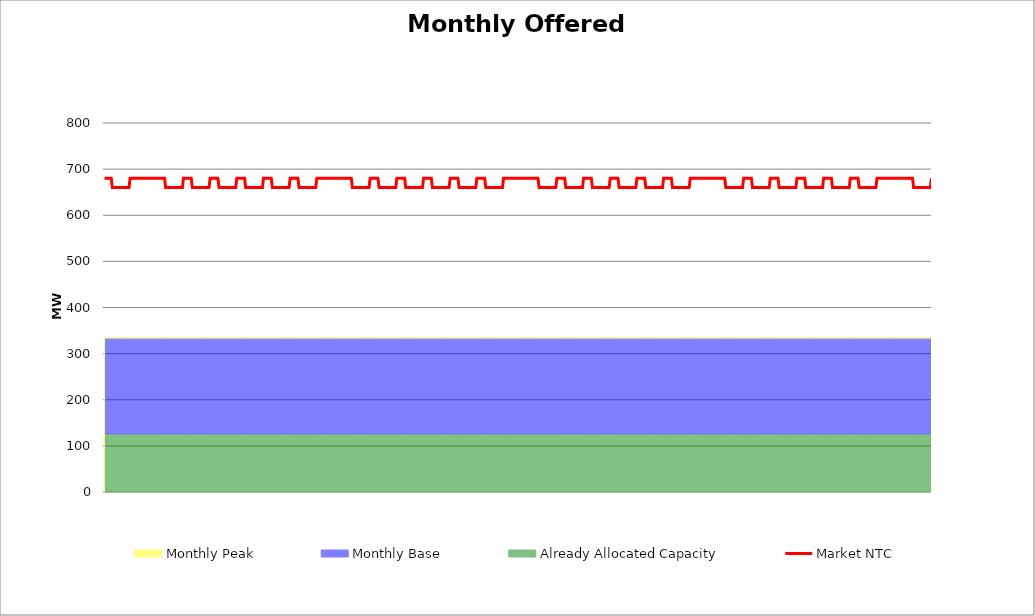
| Category | Market NTC |
|---|---|
| 0 | 680 |
| 1 | 680 |
| 2 | 680 |
| 3 | 680 |
| 4 | 680 |
| 5 | 680 |
| 6 | 680 |
| 7 | 660 |
| 8 | 660 |
| 9 | 660 |
| 10 | 660 |
| 11 | 660 |
| 12 | 660 |
| 13 | 660 |
| 14 | 660 |
| 15 | 660 |
| 16 | 660 |
| 17 | 660 |
| 18 | 660 |
| 19 | 660 |
| 20 | 660 |
| 21 | 660 |
| 22 | 660 |
| 23 | 680 |
| 24 | 680 |
| 25 | 680 |
| 26 | 680 |
| 27 | 680 |
| 28 | 680 |
| 29 | 680 |
| 30 | 680 |
| 31 | 680 |
| 32 | 680 |
| 33 | 680 |
| 34 | 680 |
| 35 | 680 |
| 36 | 680 |
| 37 | 680 |
| 38 | 680 |
| 39 | 680 |
| 40 | 680 |
| 41 | 680 |
| 42 | 680 |
| 43 | 680 |
| 44 | 680 |
| 45 | 680 |
| 46 | 680 |
| 47 | 680 |
| 48 | 680 |
| 49 | 680 |
| 50 | 680 |
| 51 | 680 |
| 52 | 680 |
| 53 | 680 |
| 54 | 680 |
| 55 | 660 |
| 56 | 660 |
| 57 | 660 |
| 58 | 660 |
| 59 | 660 |
| 60 | 660 |
| 61 | 660 |
| 62 | 660 |
| 63 | 660 |
| 64 | 660 |
| 65 | 660 |
| 66 | 660 |
| 67 | 660 |
| 68 | 660 |
| 69 | 660 |
| 70 | 660 |
| 71 | 680 |
| 72 | 680 |
| 73 | 680 |
| 74 | 680 |
| 75 | 680 |
| 76 | 680 |
| 77 | 680 |
| 78 | 680 |
| 79 | 660 |
| 80 | 660 |
| 81 | 660 |
| 82 | 660 |
| 83 | 660 |
| 84 | 660 |
| 85 | 660 |
| 86 | 660 |
| 87 | 660 |
| 88 | 660 |
| 89 | 660 |
| 90 | 660 |
| 91 | 660 |
| 92 | 660 |
| 93 | 660 |
| 94 | 660 |
| 95 | 680 |
| 96 | 680 |
| 97 | 680 |
| 98 | 680 |
| 99 | 680 |
| 100 | 680 |
| 101 | 680 |
| 102 | 680 |
| 103 | 660 |
| 104 | 660 |
| 105 | 660 |
| 106 | 660 |
| 107 | 660 |
| 108 | 660 |
| 109 | 660 |
| 110 | 660 |
| 111 | 660 |
| 112 | 660 |
| 113 | 660 |
| 114 | 660 |
| 115 | 660 |
| 116 | 660 |
| 117 | 660 |
| 118 | 660 |
| 119 | 680 |
| 120 | 680 |
| 121 | 680 |
| 122 | 680 |
| 123 | 680 |
| 124 | 680 |
| 125 | 680 |
| 126 | 680 |
| 127 | 660 |
| 128 | 660 |
| 129 | 660 |
| 130 | 660 |
| 131 | 660 |
| 132 | 660 |
| 133 | 660 |
| 134 | 660 |
| 135 | 660 |
| 136 | 660 |
| 137 | 660 |
| 138 | 660 |
| 139 | 660 |
| 140 | 660 |
| 141 | 660 |
| 142 | 660 |
| 143 | 680 |
| 144 | 680 |
| 145 | 680 |
| 146 | 680 |
| 147 | 680 |
| 148 | 680 |
| 149 | 680 |
| 150 | 680 |
| 151 | 660 |
| 152 | 660 |
| 153 | 660 |
| 154 | 660 |
| 155 | 660 |
| 156 | 660 |
| 157 | 660 |
| 158 | 660 |
| 159 | 660 |
| 160 | 660 |
| 161 | 660 |
| 162 | 660 |
| 163 | 660 |
| 164 | 660 |
| 165 | 660 |
| 166 | 660 |
| 167 | 680 |
| 168 | 680 |
| 169 | 680 |
| 170 | 680 |
| 171 | 680 |
| 172 | 680 |
| 173 | 680 |
| 174 | 680 |
| 175 | 660 |
| 176 | 660 |
| 177 | 660 |
| 178 | 660 |
| 179 | 660 |
| 180 | 660 |
| 181 | 660 |
| 182 | 660 |
| 183 | 660 |
| 184 | 660 |
| 185 | 660 |
| 186 | 660 |
| 187 | 660 |
| 188 | 660 |
| 189 | 660 |
| 190 | 660 |
| 191 | 680 |
| 192 | 680 |
| 193 | 680 |
| 194 | 680 |
| 195 | 680 |
| 196 | 680 |
| 197 | 680 |
| 198 | 680 |
| 199 | 680 |
| 200 | 680 |
| 201 | 680 |
| 202 | 680 |
| 203 | 680 |
| 204 | 680 |
| 205 | 680 |
| 206 | 680 |
| 207 | 680 |
| 208 | 680 |
| 209 | 680 |
| 210 | 680 |
| 211 | 680 |
| 212 | 680 |
| 213 | 680 |
| 214 | 680 |
| 215 | 680 |
| 216 | 680 |
| 217 | 680 |
| 218 | 680 |
| 219 | 680 |
| 220 | 680 |
| 221 | 680 |
| 222 | 680 |
| 223 | 660 |
| 224 | 660 |
| 225 | 660 |
| 226 | 660 |
| 227 | 660 |
| 228 | 660 |
| 229 | 660 |
| 230 | 660 |
| 231 | 660 |
| 232 | 660 |
| 233 | 660 |
| 234 | 660 |
| 235 | 660 |
| 236 | 660 |
| 237 | 660 |
| 238 | 660 |
| 239 | 680 |
| 240 | 680 |
| 241 | 680 |
| 242 | 680 |
| 243 | 680 |
| 244 | 680 |
| 245 | 680 |
| 246 | 680 |
| 247 | 660 |
| 248 | 660 |
| 249 | 660 |
| 250 | 660 |
| 251 | 660 |
| 252 | 660 |
| 253 | 660 |
| 254 | 660 |
| 255 | 660 |
| 256 | 660 |
| 257 | 660 |
| 258 | 660 |
| 259 | 660 |
| 260 | 660 |
| 261 | 660 |
| 262 | 660 |
| 263 | 680 |
| 264 | 680 |
| 265 | 680 |
| 266 | 680 |
| 267 | 680 |
| 268 | 680 |
| 269 | 680 |
| 270 | 680 |
| 271 | 660 |
| 272 | 660 |
| 273 | 660 |
| 274 | 660 |
| 275 | 660 |
| 276 | 660 |
| 277 | 660 |
| 278 | 660 |
| 279 | 660 |
| 280 | 660 |
| 281 | 660 |
| 282 | 660 |
| 283 | 660 |
| 284 | 660 |
| 285 | 660 |
| 286 | 660 |
| 287 | 680 |
| 288 | 680 |
| 289 | 680 |
| 290 | 680 |
| 291 | 680 |
| 292 | 680 |
| 293 | 680 |
| 294 | 680 |
| 295 | 660 |
| 296 | 660 |
| 297 | 660 |
| 298 | 660 |
| 299 | 660 |
| 300 | 660 |
| 301 | 660 |
| 302 | 660 |
| 303 | 660 |
| 304 | 660 |
| 305 | 660 |
| 306 | 660 |
| 307 | 660 |
| 308 | 660 |
| 309 | 660 |
| 310 | 660 |
| 311 | 680 |
| 312 | 680 |
| 313 | 680 |
| 314 | 680 |
| 315 | 680 |
| 316 | 680 |
| 317 | 680 |
| 318 | 680 |
| 319 | 660 |
| 320 | 660 |
| 321 | 660 |
| 322 | 660 |
| 323 | 660 |
| 324 | 660 |
| 325 | 660 |
| 326 | 660 |
| 327 | 660 |
| 328 | 660 |
| 329 | 660 |
| 330 | 660 |
| 331 | 660 |
| 332 | 660 |
| 333 | 660 |
| 334 | 660 |
| 335 | 680 |
| 336 | 680 |
| 337 | 680 |
| 338 | 680 |
| 339 | 680 |
| 340 | 680 |
| 341 | 680 |
| 342 | 680 |
| 343 | 660 |
| 344 | 660 |
| 345 | 660 |
| 346 | 660 |
| 347 | 660 |
| 348 | 660 |
| 349 | 660 |
| 350 | 660 |
| 351 | 660 |
| 352 | 660 |
| 353 | 660 |
| 354 | 660 |
| 355 | 660 |
| 356 | 660 |
| 357 | 660 |
| 358 | 660 |
| 359 | 680 |
| 360 | 680 |
| 361 | 680 |
| 362 | 680 |
| 363 | 680 |
| 364 | 680 |
| 365 | 680 |
| 366 | 680 |
| 367 | 680 |
| 368 | 680 |
| 369 | 680 |
| 370 | 680 |
| 371 | 680 |
| 372 | 680 |
| 373 | 680 |
| 374 | 680 |
| 375 | 680 |
| 376 | 680 |
| 377 | 680 |
| 378 | 680 |
| 379 | 680 |
| 380 | 680 |
| 381 | 680 |
| 382 | 680 |
| 383 | 680 |
| 384 | 680 |
| 385 | 680 |
| 386 | 680 |
| 387 | 680 |
| 388 | 680 |
| 389 | 680 |
| 390 | 680 |
| 391 | 660 |
| 392 | 660 |
| 393 | 660 |
| 394 | 660 |
| 395 | 660 |
| 396 | 660 |
| 397 | 660 |
| 398 | 660 |
| 399 | 660 |
| 400 | 660 |
| 401 | 660 |
| 402 | 660 |
| 403 | 660 |
| 404 | 660 |
| 405 | 660 |
| 406 | 660 |
| 407 | 680 |
| 408 | 680 |
| 409 | 680 |
| 410 | 680 |
| 411 | 680 |
| 412 | 680 |
| 413 | 680 |
| 414 | 680 |
| 415 | 660 |
| 416 | 660 |
| 417 | 660 |
| 418 | 660 |
| 419 | 660 |
| 420 | 660 |
| 421 | 660 |
| 422 | 660 |
| 423 | 660 |
| 424 | 660 |
| 425 | 660 |
| 426 | 660 |
| 427 | 660 |
| 428 | 660 |
| 429 | 660 |
| 430 | 660 |
| 431 | 680 |
| 432 | 680 |
| 433 | 680 |
| 434 | 680 |
| 435 | 680 |
| 436 | 680 |
| 437 | 680 |
| 438 | 680 |
| 439 | 660 |
| 440 | 660 |
| 441 | 660 |
| 442 | 660 |
| 443 | 660 |
| 444 | 660 |
| 445 | 660 |
| 446 | 660 |
| 447 | 660 |
| 448 | 660 |
| 449 | 660 |
| 450 | 660 |
| 451 | 660 |
| 452 | 660 |
| 453 | 660 |
| 454 | 660 |
| 455 | 680 |
| 456 | 680 |
| 457 | 680 |
| 458 | 680 |
| 459 | 680 |
| 460 | 680 |
| 461 | 680 |
| 462 | 680 |
| 463 | 660 |
| 464 | 660 |
| 465 | 660 |
| 466 | 660 |
| 467 | 660 |
| 468 | 660 |
| 469 | 660 |
| 470 | 660 |
| 471 | 660 |
| 472 | 660 |
| 473 | 660 |
| 474 | 660 |
| 475 | 660 |
| 476 | 660 |
| 477 | 660 |
| 478 | 660 |
| 479 | 680 |
| 480 | 680 |
| 481 | 680 |
| 482 | 680 |
| 483 | 680 |
| 484 | 680 |
| 485 | 680 |
| 486 | 680 |
| 487 | 660 |
| 488 | 660 |
| 489 | 660 |
| 490 | 660 |
| 491 | 660 |
| 492 | 660 |
| 493 | 660 |
| 494 | 660 |
| 495 | 660 |
| 496 | 660 |
| 497 | 660 |
| 498 | 660 |
| 499 | 660 |
| 500 | 660 |
| 501 | 660 |
| 502 | 660 |
| 503 | 680 |
| 504 | 680 |
| 505 | 680 |
| 506 | 680 |
| 507 | 680 |
| 508 | 680 |
| 509 | 680 |
| 510 | 680 |
| 511 | 660 |
| 512 | 660 |
| 513 | 660 |
| 514 | 660 |
| 515 | 660 |
| 516 | 660 |
| 517 | 660 |
| 518 | 660 |
| 519 | 660 |
| 520 | 660 |
| 521 | 660 |
| 522 | 660 |
| 523 | 660 |
| 524 | 660 |
| 525 | 660 |
| 526 | 660 |
| 527 | 680 |
| 528 | 680 |
| 529 | 680 |
| 530 | 680 |
| 531 | 680 |
| 532 | 680 |
| 533 | 680 |
| 534 | 680 |
| 535 | 680 |
| 536 | 680 |
| 537 | 680 |
| 538 | 680 |
| 539 | 680 |
| 540 | 680 |
| 541 | 680 |
| 542 | 680 |
| 543 | 680 |
| 544 | 680 |
| 545 | 680 |
| 546 | 680 |
| 547 | 680 |
| 548 | 680 |
| 549 | 680 |
| 550 | 680 |
| 551 | 680 |
| 552 | 680 |
| 553 | 680 |
| 554 | 680 |
| 555 | 680 |
| 556 | 680 |
| 557 | 680 |
| 558 | 680 |
| 559 | 660 |
| 560 | 660 |
| 561 | 660 |
| 562 | 660 |
| 563 | 660 |
| 564 | 660 |
| 565 | 660 |
| 566 | 660 |
| 567 | 660 |
| 568 | 660 |
| 569 | 660 |
| 570 | 660 |
| 571 | 660 |
| 572 | 660 |
| 573 | 660 |
| 574 | 660 |
| 575 | 680 |
| 576 | 680 |
| 577 | 680 |
| 578 | 680 |
| 579 | 680 |
| 580 | 680 |
| 581 | 680 |
| 582 | 680 |
| 583 | 660 |
| 584 | 660 |
| 585 | 660 |
| 586 | 660 |
| 587 | 660 |
| 588 | 660 |
| 589 | 660 |
| 590 | 660 |
| 591 | 660 |
| 592 | 660 |
| 593 | 660 |
| 594 | 660 |
| 595 | 660 |
| 596 | 660 |
| 597 | 660 |
| 598 | 660 |
| 599 | 680 |
| 600 | 680 |
| 601 | 680 |
| 602 | 680 |
| 603 | 680 |
| 604 | 680 |
| 605 | 680 |
| 606 | 680 |
| 607 | 660 |
| 608 | 660 |
| 609 | 660 |
| 610 | 660 |
| 611 | 660 |
| 612 | 660 |
| 613 | 660 |
| 614 | 660 |
| 615 | 660 |
| 616 | 660 |
| 617 | 660 |
| 618 | 660 |
| 619 | 660 |
| 620 | 660 |
| 621 | 660 |
| 622 | 660 |
| 623 | 680 |
| 624 | 680 |
| 625 | 680 |
| 626 | 680 |
| 627 | 680 |
| 628 | 680 |
| 629 | 680 |
| 630 | 680 |
| 631 | 660 |
| 632 | 660 |
| 633 | 660 |
| 634 | 660 |
| 635 | 660 |
| 636 | 660 |
| 637 | 660 |
| 638 | 660 |
| 639 | 660 |
| 640 | 660 |
| 641 | 660 |
| 642 | 660 |
| 643 | 660 |
| 644 | 660 |
| 645 | 660 |
| 646 | 660 |
| 647 | 680 |
| 648 | 680 |
| 649 | 680 |
| 650 | 680 |
| 651 | 680 |
| 652 | 680 |
| 653 | 680 |
| 654 | 680 |
| 655 | 660 |
| 656 | 660 |
| 657 | 660 |
| 658 | 660 |
| 659 | 660 |
| 660 | 660 |
| 661 | 660 |
| 662 | 660 |
| 663 | 660 |
| 664 | 660 |
| 665 | 660 |
| 666 | 660 |
| 667 | 660 |
| 668 | 660 |
| 669 | 660 |
| 670 | 660 |
| 671 | 680 |
| 672 | 680 |
| 673 | 680 |
| 674 | 680 |
| 675 | 680 |
| 676 | 680 |
| 677 | 680 |
| 678 | 680 |
| 679 | 660 |
| 680 | 660 |
| 681 | 660 |
| 682 | 660 |
| 683 | 660 |
| 684 | 660 |
| 685 | 660 |
| 686 | 660 |
| 687 | 660 |
| 688 | 660 |
| 689 | 660 |
| 690 | 660 |
| 691 | 660 |
| 692 | 660 |
| 693 | 660 |
| 694 | 660 |
| 695 | 680 |
| 696 | 680 |
| 697 | 680 |
| 698 | 680 |
| 699 | 680 |
| 700 | 680 |
| 701 | 680 |
| 702 | 680 |
| 703 | 680 |
| 704 | 680 |
| 705 | 680 |
| 706 | 680 |
| 707 | 680 |
| 708 | 680 |
| 709 | 680 |
| 710 | 680 |
| 711 | 680 |
| 712 | 680 |
| 713 | 680 |
| 714 | 680 |
| 715 | 680 |
| 716 | 680 |
| 717 | 680 |
| 718 | 680 |
| 719 | 680 |
| 720 | 680 |
| 721 | 680 |
| 722 | 680 |
| 723 | 680 |
| 724 | 680 |
| 725 | 680 |
| 726 | 680 |
| 727 | 680 |
| 728 | 660 |
| 729 | 660 |
| 730 | 660 |
| 731 | 660 |
| 732 | 660 |
| 733 | 660 |
| 734 | 660 |
| 735 | 660 |
| 736 | 660 |
| 737 | 660 |
| 738 | 660 |
| 739 | 660 |
| 740 | 660 |
| 741 | 660 |
| 742 | 660 |
| 743 | 660 |
| 744 | 680 |